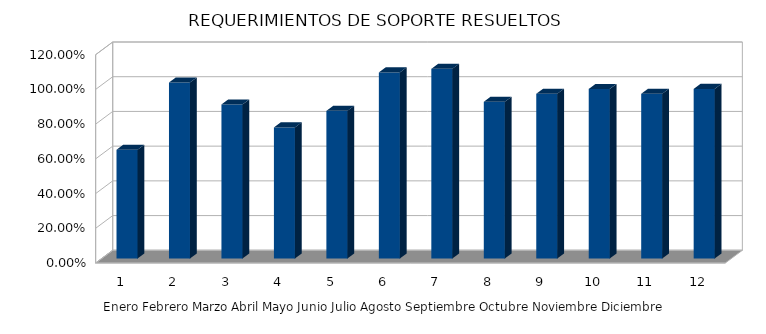
| Category | Series 0 |
|---|---|
| 0 | 0.627 |
| 1 | 1.014 |
| 2 | 0.888 |
| 3 | 0.755 |
| 4 | 0.851 |
| 5 | 1.072 |
| 6 | 1.093 |
| 7 | 0.903 |
| 8 | 0.949 |
| 9 | 0.977 |
| 10 | 0.949 |
| 11 | 0.977 |